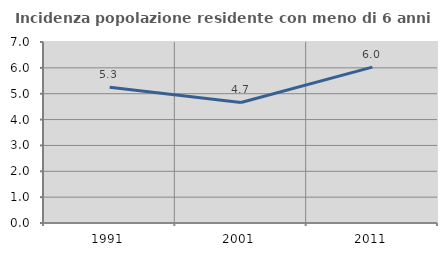
| Category | Incidenza popolazione residente con meno di 6 anni |
|---|---|
| 1991.0 | 5.252 |
| 2001.0 | 4.661 |
| 2011.0 | 6.03 |